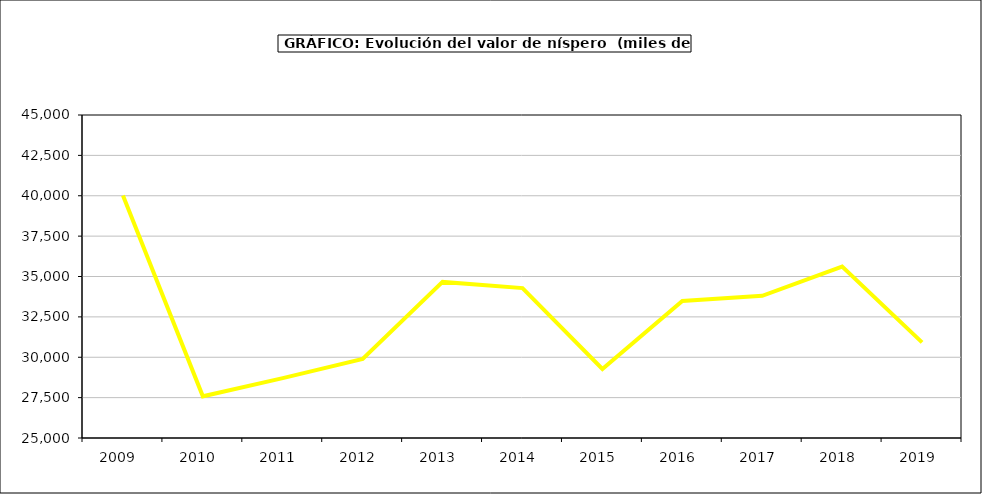
| Category | valor níspero |
|---|---|
| 2009.0 | 40013.597 |
| 2010.0 | 27580.978 |
| 2011.0 | 28708.277 |
| 2012.0 | 29897.05 |
| 2013.0 | 34664.445 |
| 2014.0 | 34281.045 |
| 2015.0 | 29278 |
| 2016.0 | 33490 |
| 2017.0 | 33807.127 |
| 2018.0 | 35617.316 |
| 2019.0 | 30923.726 |